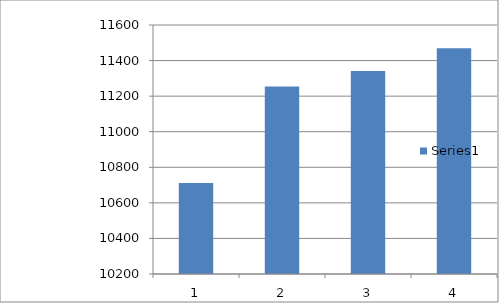
| Category | Series 0 |
|---|---|
| 0 | 10712 |
| 1 | 11254 |
| 2 | 11342 |
| 3 | 11469 |